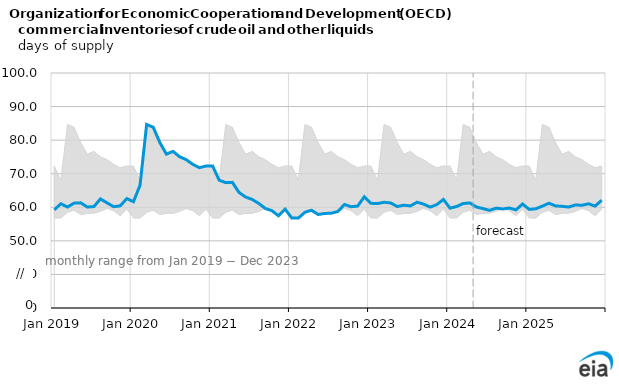
| Category | OECD commercial crude oil stocks |
|---|---|
| 2019-01-01 | 59.243 |
| 2019-02-01 | 61.038 |
| 2019-03-01 | 60.076 |
| 2019-04-01 | 61.235 |
| 2019-05-01 | 61.324 |
| 2019-06-01 | 60.081 |
| 2019-07-01 | 60.208 |
| 2019-08-01 | 62.483 |
| 2019-09-01 | 61.32 |
| 2019-10-01 | 60.177 |
| 2019-11-01 | 60.43 |
| 2019-12-01 | 62.594 |
| 2020-01-01 | 61.668 |
| 2020-02-01 | 66.554 |
| 2020-03-01 | 84.661 |
| 2020-04-01 | 83.847 |
| 2020-05-01 | 79.293 |
| 2020-06-01 | 75.83 |
| 2020-07-01 | 76.661 |
| 2020-08-01 | 75.047 |
| 2020-09-01 | 74.19 |
| 2020-10-01 | 72.783 |
| 2020-11-01 | 71.79 |
| 2020-12-01 | 72.299 |
| 2021-01-01 | 72.316 |
| 2021-02-01 | 68.065 |
| 2021-03-01 | 67.34 |
| 2021-04-01 | 67.421 |
| 2021-05-01 | 64.439 |
| 2021-06-01 | 63.069 |
| 2021-07-01 | 62.338 |
| 2021-08-01 | 61.148 |
| 2021-09-01 | 59.65 |
| 2021-10-01 | 58.979 |
| 2021-11-01 | 57.454 |
| 2021-12-01 | 59.451 |
| 2022-01-01 | 56.812 |
| 2022-02-01 | 56.772 |
| 2022-03-01 | 58.518 |
| 2022-04-01 | 59.116 |
| 2022-05-01 | 57.848 |
| 2022-06-01 | 58.157 |
| 2022-07-01 | 58.233 |
| 2022-08-01 | 58.75 |
| 2022-09-01 | 60.839 |
| 2022-10-01 | 60.167 |
| 2022-11-01 | 60.373 |
| 2022-12-01 | 63.106 |
| 2023-01-01 | 61.188 |
| 2023-02-01 | 61.104 |
| 2023-03-01 | 61.488 |
| 2023-04-01 | 61.295 |
| 2023-05-01 | 60.229 |
| 2023-06-01 | 60.618 |
| 2023-07-01 | 60.41 |
| 2023-08-01 | 61.512 |
| 2023-09-01 | 60.948 |
| 2023-10-01 | 60.057 |
| 2023-11-01 | 60.802 |
| 2023-12-01 | 62.334 |
| 2024-01-01 | 59.741 |
| 2024-02-01 | 60.222 |
| 2024-03-01 | 61.126 |
| 2024-04-01 | 61.295 |
| 2024-05-01 | 60.089 |
| 2024-06-01 | 59.615 |
| 2024-07-01 | 59.073 |
| 2024-08-01 | 59.752 |
| 2024-09-01 | 59.494 |
| 2024-10-01 | 59.782 |
| 2024-11-01 | 59.228 |
| 2024-12-01 | 60.982 |
| 2025-01-01 | 59.385 |
| 2025-02-01 | 59.548 |
| 2025-03-01 | 60.339 |
| 2025-04-01 | 61.2 |
| 2025-05-01 | 60.415 |
| 2025-06-01 | 60.283 |
| 2025-07-01 | 60.074 |
| 2025-08-01 | 60.69 |
| 2025-09-01 | 60.597 |
| 2025-10-01 | 61.038 |
| 2025-11-01 | 60.352 |
| 2025-12-01 | 62.106 |